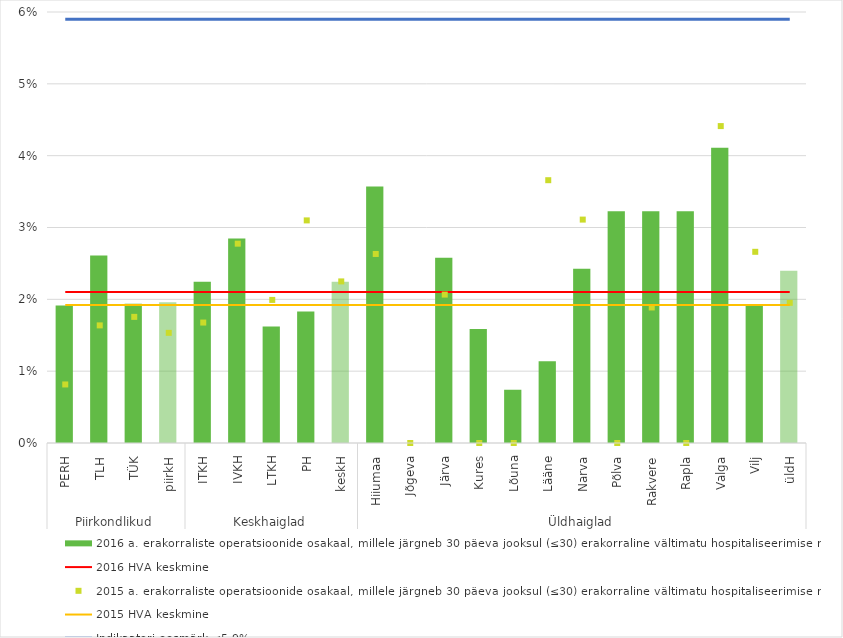
| Category | 2016 a. erakorraliste operatsioonide osakaal, millele järgneb 30 päeva jooksul (≤30) erakorraline vältimatu hospitaliseerimise raviarve |
|---|---|
| 0 | 0.019 |
| 1 | 0.026 |
| 2 | 0.019 |
| 3 | 0.02 |
| 4 | 0.022 |
| 5 | 0.028 |
| 6 | 0.016 |
| 7 | 0.018 |
| 8 | 0.022 |
| 9 | 0.036 |
| 10 | 0 |
| 11 | 0.026 |
| 12 | 0.016 |
| 13 | 0.007 |
| 14 | 0.011 |
| 15 | 0.024 |
| 16 | 0.032 |
| 17 | 0.032 |
| 18 | 0.032 |
| 19 | 0.041 |
| 20 | 0.019 |
| 21 | 0.024 |